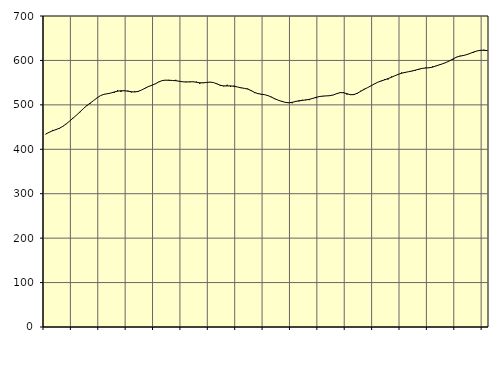
| Category | Piggar | Series 1 |
|---|---|---|
| nan | 433.7 | 434.3 |
| 87.0 | 438.2 | 438.15 |
| 87.0 | 443.5 | 441.67 |
| 87.0 | 444.2 | 444.37 |
| nan | 446.3 | 447.31 |
| 88.0 | 452.3 | 451.6 |
| 88.0 | 456.7 | 457.25 |
| 88.0 | 463.7 | 463.6 |
| nan | 470.9 | 470.22 |
| 89.0 | 476.8 | 476.99 |
| 89.0 | 483.4 | 484.13 |
| 89.0 | 491.3 | 491.46 |
| nan | 499.2 | 498.15 |
| 90.0 | 502.9 | 504.04 |
| 90.0 | 509.6 | 509.77 |
| 90.0 | 515.7 | 515.72 |
| nan | 521 | 520.71 |
| 91.0 | 523.7 | 523.68 |
| 91.0 | 524.7 | 525.03 |
| 91.0 | 526.6 | 526.55 |
| nan | 526.8 | 528.94 |
| 92.0 | 533.3 | 530.79 |
| 92.0 | 529 | 531.75 |
| 92.0 | 533.1 | 531.65 |
| nan | 532 | 530.78 |
| 93.0 | 527.9 | 529.59 |
| 93.0 | 530.5 | 528.97 |
| 93.0 | 528.9 | 530.32 |
| nan | 533.4 | 533.34 |
| 94.0 | 536.7 | 537.44 |
| 94.0 | 542.5 | 541.16 |
| 94.0 | 543.3 | 544.06 |
| nan | 546.7 | 547.3 |
| 95.0 | 551.9 | 551.33 |
| 95.0 | 554.7 | 554.63 |
| 95.0 | 556 | 555.57 |
| nan | 556.3 | 555.28 |
| 96.0 | 555.1 | 554.92 |
| 96.0 | 556.4 | 554.35 |
| 96.0 | 552.8 | 553.19 |
| nan | 552.2 | 551.93 |
| 97.0 | 552.3 | 551.4 |
| 97.0 | 551 | 551.82 |
| 97.0 | 552.3 | 551.99 |
| nan | 552.3 | 550.97 |
| 98.0 | 547.1 | 549.67 |
| 98.0 | 550.4 | 549.48 |
| 98.0 | 550.8 | 550.44 |
| nan | 551.1 | 551.21 |
| 99.0 | 550 | 550.21 |
| 99.0 | 548.1 | 547.26 |
| 99.0 | 542.4 | 544.12 |
| nan | 541.5 | 542.64 |
| 0.0 | 545.3 | 542.67 |
| 0.0 | 540.5 | 542.66 |
| 0.0 | 543.4 | 541.79 |
| nan | 540.3 | 540.28 |
| 1.0 | 537.8 | 538.54 |
| 1.0 | 537 | 537.19 |
| 1.0 | 536.8 | 535.54 |
| nan | 533.3 | 532.18 |
| 2.0 | 526.5 | 528.05 |
| 2.0 | 526 | 525.29 |
| 2.0 | 522.8 | 524.04 |
| nan | 522.7 | 522.81 |
| 3.0 | 520.3 | 520.58 |
| 3.0 | 518.1 | 517.17 |
| 3.0 | 512.9 | 513.46 |
| nan | 510.6 | 510.26 |
| 4.0 | 508.8 | 507.79 |
| 4.0 | 505.2 | 505.59 |
| 4.0 | 505.4 | 504.62 |
| nan | 503.6 | 505.7 |
| 5.0 | 508.8 | 507.6 |
| 5.0 | 507.6 | 509.21 |
| 5.0 | 511.4 | 510.09 |
| nan | 512 | 510.99 |
| 6.0 | 510.6 | 512.4 |
| 6.0 | 515.3 | 514.52 |
| 6.0 | 515 | 517 |
| nan | 519.7 | 518.78 |
| 7.0 | 519.2 | 519.73 |
| 7.0 | 520.5 | 520.15 |
| 7.0 | 520.2 | 520.65 |
| nan | 522 | 522.28 |
| 8.0 | 524.5 | 525.17 |
| 8.0 | 528.2 | 527.51 |
| 8.0 | 528.4 | 527.3 |
| nan | 523.1 | 525.06 |
| 9.0 | 522.1 | 522.89 |
| 9.0 | 524.4 | 523.07 |
| 9.0 | 524.6 | 525.99 |
| nan | 531.7 | 530.45 |
| 10.0 | 536 | 534.84 |
| 10.0 | 538.8 | 538.66 |
| 10.0 | 543 | 542.68 |
| nan | 547.4 | 547.03 |
| 11.0 | 550.9 | 550.87 |
| 11.0 | 553.1 | 553.84 |
| 11.0 | 557.9 | 556.3 |
| nan | 557 | 559.05 |
| 12.0 | 563.8 | 562.14 |
| 12.0 | 565.5 | 565.49 |
| 12.0 | 568 | 568.76 |
| nan | 573 | 571.23 |
| 13.0 | 571.6 | 573.11 |
| 13.0 | 574.4 | 574.56 |
| 13.0 | 575.7 | 576.21 |
| nan | 576.8 | 578.12 |
| 14.0 | 578.8 | 580.28 |
| 14.0 | 582.2 | 582.11 |
| 14.0 | 584 | 582.92 |
| nan | 582.9 | 583.51 |
| 15.0 | 586.5 | 584.9 |
| 15.0 | 587.8 | 587.47 |
| 15.0 | 590.7 | 590.03 |
| nan | 592.4 | 592.56 |
| 16.0 | 595.4 | 595.5 |
| 16.0 | 599.7 | 599.12 |
| 16.0 | 601.4 | 603.38 |
| nan | 607.9 | 607.26 |
| 17.0 | 610.6 | 609.65 |
| 17.0 | 610 | 611.09 |
| 17.0 | 612.6 | 613.07 |
| nan | 616 | 615.89 |
| 18.0 | 617.2 | 618.9 |
| 18.0 | 621.4 | 621.35 |
| 18.0 | 623.5 | 622.74 |
| nan | 624.2 | 622.77 |
| 19.0 | 621.5 | 622.15 |